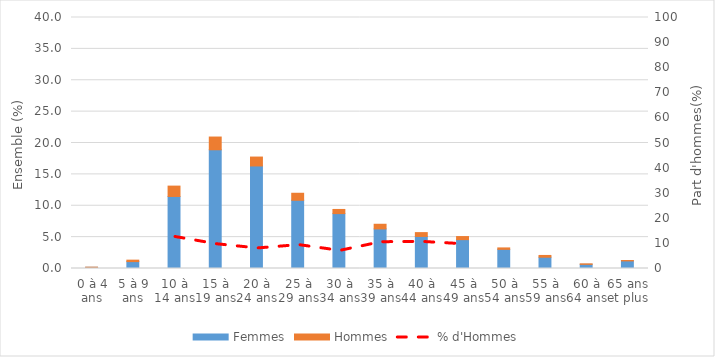
| Category | Femmes | Hommes |
|---|---|---|
| 0 à 4 ans | 0.19 | 0.02 |
| 5 à 9 ans | 1.1 | 0.23 |
| 10 à 14 ans | 11.48 | 1.65 |
| 15 à 19 ans | 18.92 | 2.03 |
| 20 à 24 ans | 16.34 | 1.42 |
| 25 à 29 ans | 10.87 | 1.12 |
| 30 à 34 ans | 8.75 | 0.66 |
| 35 à 39 ans | 6.31 | 0.74 |
| 40 à 44 ans | 5.11 | 0.61 |
| 45 à 49 ans | 4.6 | 0.49 |
| 50 à 54 ans | 3.05 | 0.23 |
| 55 à 59 ans | 1.8 | 0.28 |
| 60 à 64 ans | 0.66 | 0.08 |
| 65 ans et plus | 1.21 | 0.06 |